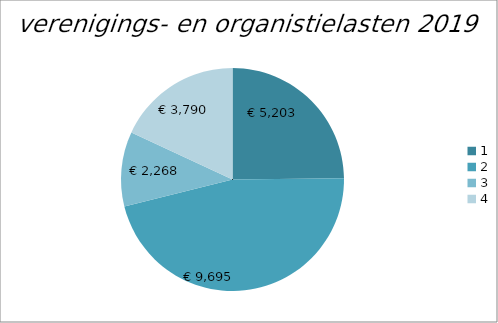
| Category | Series 0 |
|---|---|
| 0 | 5203 |
| 1 | 9695 |
| 2 | 2268 |
| 3 | 3790 |